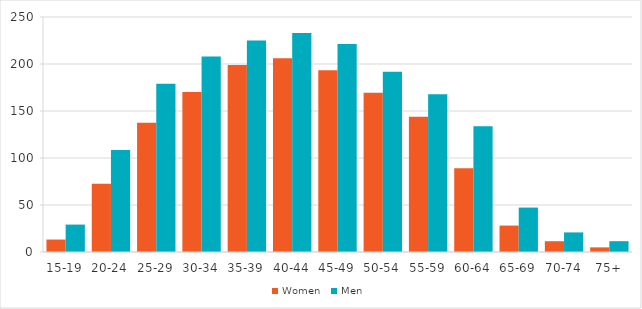
| Category | Women | Men |
|---|---|---|
| 15-19 | 13.235 | 29.159 |
| 20-24 | 72.532 | 108.616 |
| 25-29 | 137.559 | 179.025 |
| 30-34 | 170.121 | 207.903 |
| 35-39 | 198.844 | 224.913 |
| 40-44 | 206.106 | 233.028 |
| 45-49 | 193.265 | 221.221 |
| 50-54 | 169.341 | 191.841 |
| 55-59 | 143.953 | 167.799 |
| 60-64 | 89.169 | 133.869 |
| 65-69 | 28.102 | 47.257 |
| 70-74 | 11.48 | 20.836 |
| 75+ | 4.943 | 11.509 |